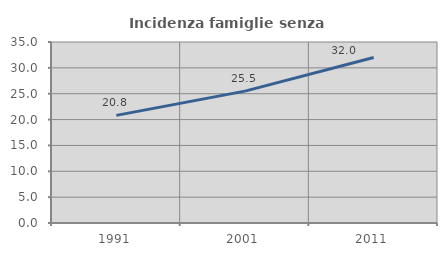
| Category | Incidenza famiglie senza nuclei |
|---|---|
| 1991.0 | 20.811 |
| 2001.0 | 25.501 |
| 2011.0 | 31.994 |